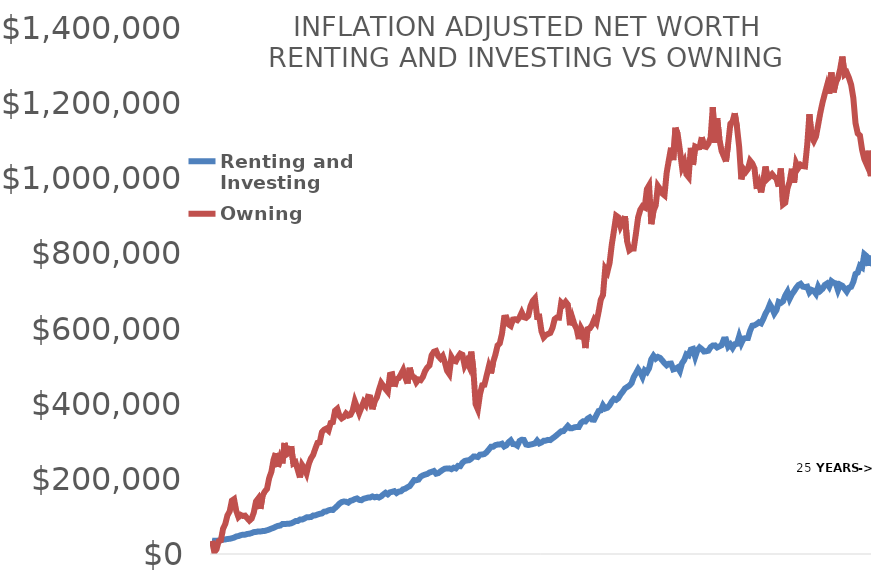
| Category | Renting and Investing | Owning |
|---|---|---|
| 0.0 | 35143 | 35143 |
| 1.0 | 35041.116 | 4970.673 |
| 2.0 | 35237.92 | 12406.018 |
| 3.0 | 35954.826 | 34122.667 |
| 4.0 | 36668.921 | 36554.564 |
| 5.0 | 38039.22 | 67417.757 |
| 6.0 | 38803.411 | 79814.079 |
| 7.0 | 39967.037 | 102888.735 |
| 8.0 | 40494.45 | 113419.601 |
| 9.0 | 41851.406 | 141990.25 |
| 10.0 | 43666.068 | 146000.883 |
| 11.0 | 46679.268 | 114931.032 |
| 12.0 | 47745.613 | 98284.657 |
| 13.0 | 50001.919 | 104050.503 |
| 14.0 | 51463.166 | 101179.522 |
| 15.0 | 51469.582 | 102160.158 |
| 16.0 | 53304.943 | 95342.644 |
| 17.0 | 54004.239 | 88877.305 |
| 18.0 | 55711.023 | 94125.601 |
| 19.0 | 58258.802 | 110587.55 |
| 20.0 | 58789.847 | 139993.731 |
| 21.0 | 60042.64 | 147678.933 |
| 22.0 | 59884.463 | 120287.044 |
| 23.0 | 61008.695 | 155661.869 |
| 24.0 | 61449.11 | 166263.627 |
| 25.0 | 63199.008 | 173331.382 |
| 26.0 | 65118.898 | 202464.821 |
| 27.0 | 67601.989 | 218736.165 |
| 28.0 | 69652.84 | 251401.689 |
| 29.0 | 72584.162 | 268591.856 |
| 30.0 | 74892.972 | 231693.532 |
| 31.0 | 75667.365 | 255499.706 |
| 32.0 | 79641.852 | 241142.728 |
| 33.0 | 79660.314 | 295523.627 |
| 34.0 | 80268.475 | 265312.203 |
| 35.0 | 80443.292 | 269169.767 |
| 36.0 | 81648.869 | 286807.545 |
| 37.0 | 84200.906 | 240844.606 |
| 38.0 | 87601.782 | 244019.191 |
| 39.0 | 87939.642 | 224139.784 |
| 40.0 | 91586.486 | 203647.611 |
| 41.0 | 91673.981 | 237014.867 |
| 42.0 | 94120.109 | 228146.709 |
| 43.0 | 97548.538 | 214489.579 |
| 44.0 | 98049.605 | 239296.116 |
| 45.0 | 98264.089 | 254313.017 |
| 46.0 | 102428.195 | 263626.651 |
| 47.0 | 102775.898 | 280406.265 |
| 48.0 | 104991.545 | 295858.669 |
| 49.0 | 106933.723 | 297210.695 |
| 50.0 | 107917.399 | 324363.613 |
| 51.0 | 112657.497 | 330735.994 |
| 52.0 | 113265.652 | 333657.157 |
| 53.0 | 116256.744 | 328272.815 |
| 54.0 | 117717.206 | 348924.155 |
| 55.0 | 117138.042 | 350915.09 |
| 56.0 | 122545.568 | 381502.656 |
| 57.0 | 127742.079 | 386492.178 |
| 58.0 | 134145.699 | 367459.918 |
| 59.0 | 138209.887 | 360892.552 |
| 60.0 | 139775.365 | 364730.163 |
| 61.0 | 139075.48 | 373949.285 |
| 62.0 | 136729.748 | 368370.564 |
| 63.0 | 141632.043 | 370448.555 |
| 64.0 | 143140.951 | 381634.572 |
| 65.0 | 146216.856 | 406512.777 |
| 66.0 | 147882.155 | 390958.771 |
| 67.0 | 144034.38 | 374876.919 |
| 68.0 | 143203.796 | 389533.519 |
| 69.0 | 147027.722 | 404495.956 |
| 70.0 | 148484.772 | 396653.965 |
| 71.0 | 150128.702 | 418322.13 |
| 72.0 | 150561.775 | 417111.357 |
| 73.0 | 153189.194 | 385182.248 |
| 74.0 | 150841.135 | 406312.844 |
| 75.0 | 152354.716 | 416385.473 |
| 76.0 | 150363.38 | 437116.191 |
| 77.0 | 153413.971 | 455325.083 |
| 78.0 | 158618.437 | 447060.192 |
| 79.0 | 162937.228 | 438876.099 |
| 80.0 | 158862.439 | 431751.978 |
| 81.0 | 164137.173 | 477002.716 |
| 82.0 | 165571.965 | 478400.414 |
| 83.0 | 167259.911 | 445532.046 |
| 84.0 | 162243.717 | 465425.453 |
| 85.0 | 166070.911 | 468051.956 |
| 86.0 | 166894.05 | 478195.837 |
| 87.0 | 172265.184 | 489478.077 |
| 88.0 | 173911.257 | 469415.212 |
| 89.0 | 177887.471 | 453737.065 |
| 90.0 | 180585.931 | 495647.563 |
| 91.0 | 188712.953 | 471991.418 |
| 92.0 | 196727.719 | 470270.581 |
| 93.0 | 196414.628 | 456940.327 |
| 94.0 | 198020.174 | 464416.843 |
| 95.0 | 205984.509 | 462652.301 |
| 96.0 | 209163.503 | 471538.459 |
| 97.0 | 211454.78 | 486925.424 |
| 98.0 | 213069.726 | 496454.355 |
| 99.0 | 216845.16 | 502259.188 |
| 100.0 | 218651.038 | 529393.598 |
| 101.0 | 220861.608 | 538306.335 |
| 102.0 | 213741.094 | 540407.058 |
| 103.0 | 215297.306 | 526693.052 |
| 104.0 | 219832.407 | 520197.931 |
| 105.0 | 223891.438 | 526876.815 |
| 106.0 | 227057.649 | 510033.752 |
| 107.0 | 227614.393 | 487678.423 |
| 108.0 | 227898.199 | 479197.981 |
| 109.0 | 225754.097 | 524504.538 |
| 110.0 | 229637.889 | 514467.458 |
| 111.0 | 227702.194 | 512698.132 |
| 112.0 | 234467.967 | 524581.877 |
| 113.0 | 233746.94 | 533029.376 |
| 114.0 | 242813.731 | 530278.701 |
| 115.0 | 247476.09 | 501545.954 |
| 116.0 | 248925.629 | 512923.176 |
| 117.0 | 249685.456 | 500055.214 |
| 118.0 | 253533.822 | 538688.551 |
| 119.0 | 259206.345 | 488281.129 |
| 120.0 | 259263.016 | 398779.002 |
| 121.0 | 258099.426 | 385049.29 |
| 122.0 | 264365.21 | 425513.651 |
| 123.0 | 264756.349 | 449180.521 |
| 124.0 | 266117.903 | 450324.004 |
| 125.0 | 270923.327 | 474240.12 |
| 126.0 | 278011.131 | 498299.963 |
| 127.0 | 285350.615 | 480754.211 |
| 128.0 | 285578.847 | 511322.861 |
| 129.0 | 289859.016 | 530274.598 |
| 130.0 | 291302.703 | 555120.956 |
| 131.0 | 291558.636 | 560565.057 |
| 132.0 | 293610.697 | 586003.855 |
| 133.0 | 286176.054 | 628860.812 |
| 134.0 | 289324.31 | 629569.224 |
| 135.0 | 297421.62 | 611166.41 |
| 136.0 | 302396.204 | 607101.907 |
| 137.0 | 292641.071 | 624003.154 |
| 138.0 | 291916.552 | 624924.709 |
| 139.0 | 288296.889 | 622343.05 |
| 140.0 | 300774.754 | 629884.078 |
| 141.0 | 304153.64 | 642751.54 |
| 142.0 | 303481.208 | 630309.046 |
| 143.0 | 291444.116 | 628492.712 |
| 144.0 | 289976.82 | 634148.058 |
| 145.0 | 291321.064 | 659818.89 |
| 146.0 | 292637.254 | 673512.683 |
| 147.0 | 294380.728 | 680351.781 |
| 148.0 | 301708.538 | 631264.055 |
| 149.0 | 294369.282 | 631839.208 |
| 150.0 | 296981.382 | 592626.133 |
| 151.0 | 301361.198 | 576654.952 |
| 152.0 | 301780.633 | 582661.092 |
| 153.0 | 303721.002 | 585858.3 |
| 154.0 | 303191.549 | 588335.542 |
| 155.0 | 307772.038 | 601688.979 |
| 156.0 | 311916.009 | 625072.509 |
| 157.0 | 316732.515 | 629501.638 |
| 158.0 | 321824.151 | 629066.824 |
| 159.0 | 326580.93 | 669121.361 |
| 160.0 | 327080.737 | 663546.744 |
| 161.0 | 333890.985 | 671185.945 |
| 162.0 | 340664.075 | 663643.356 |
| 163.0 | 334897.358 | 608820.48 |
| 164.0 | 334904.058 | 629691.606 |
| 165.0 | 337233.037 | 610984.8 |
| 166.0 | 338014.059 | 599732.611 |
| 167.0 | 338171.608 | 571911.323 |
| 168.0 | 349087.38 | 601413.623 |
| 169.0 | 353369.467 | 590666.192 |
| 170.0 | 352733.363 | 548129.177 |
| 171.0 | 360240.619 | 598474.838 |
| 172.0 | 363776.593 | 600637.703 |
| 173.0 | 357708.425 | 609423.182 |
| 174.0 | 357512.543 | 623782.11 |
| 175.0 | 369335.38 | 615361.096 |
| 176.0 | 380668.475 | 644379.35 |
| 177.0 | 382229.608 | 676948.01 |
| 178.0 | 395625.635 | 689333.537 |
| 179.0 | 387130.51 | 759403.628 |
| 180.0 | 389281.396 | 750544.53 |
| 181.0 | 395905.328 | 774338.513 |
| 182.0 | 405793.915 | 823377.071 |
| 183.0 | 413062.126 | 860999.358 |
| 184.0 | 410308.576 | 900367.67 |
| 185.0 | 414796.847 | 896171.546 |
| 186.0 | 424719.236 | 872219.468 |
| 187.0 | 431963.309 | 884291.464 |
| 188.0 | 440552.919 | 899208.553 |
| 189.0 | 444528.192 | 831763.789 |
| 190.0 | 448112.322 | 808489.259 |
| 191.0 | 454674.804 | 812728.678 |
| 192.0 | 470940.491 | 813004.541 |
| 193.0 | 480897.959 | 852643.852 |
| 194.0 | 491785.763 | 896249.205 |
| 195.0 | 483118.519 | 916314.042 |
| 196.0 | 471253.677 | 925587.743 |
| 197.0 | 488656.722 | 922423.519 |
| 198.0 | 484130.001 | 971163.245 |
| 199.0 | 494780.655 | 981094.499 |
| 200.0 | 518261.219 | 877862.47 |
| 201.0 | 527605.298 | 913318.442 |
| 202.0 | 519969.556 | 927561.955 |
| 203.0 | 524500.489 | 979595.775 |
| 204.0 | 521913.841 | 971313.033 |
| 205.0 | 515150.061 | 959544.858 |
| 206.0 | 507859.258 | 954754.111 |
| 207.0 | 502291.711 | 1015092.232 |
| 208.0 | 506469.531 | 1048986.007 |
| 209.0 | 506787.598 | 1081433.421 |
| 210.0 | 491345.84 | 1048432.203 |
| 211.0 | 493169.501 | 1134555.113 |
| 212.0 | 496631.706 | 1117609.072 |
| 213.0 | 486969.925 | 1076163.057 |
| 214.0 | 507880.889 | 1030002.658 |
| 215.0 | 516328.453 | 1043379.045 |
| 216.0 | 531577.701 | 1010507.836 |
| 217.0 | 528648.875 | 1003200.545 |
| 218.0 | 544095.355 | 1081076.273 |
| 219.0 | 545951.323 | 1035596.247 |
| 220.0 | 524874.648 | 1084367.789 |
| 221.0 | 542231.085 | 1081752.921 |
| 222.0 | 549718.922 | 1082620.321 |
| 223.0 | 545116.779 | 1109319.184 |
| 224.0 | 538927.501 | 1085060.015 |
| 225.0 | 539672.181 | 1083391.227 |
| 226.0 | 541202.15 | 1092320.935 |
| 227.0 | 550560.952 | 1107945.385 |
| 228.0 | 554912.401 | 1189320.061 |
| 229.0 | 555209.284 | 1094853.879 |
| 230.0 | 549668.701 | 1159813.432 |
| 231.0 | 552618.966 | 1104963.36 |
| 232.0 | 555673.528 | 1072837.932 |
| 233.0 | 570937.663 | 1059031.672 |
| 234.0 | 571235.82 | 1044818.035 |
| 235.0 | 551799.367 | 1091528.357 |
| 236.0 | 557537.295 | 1144852.405 |
| 237.0 | 548545.83 | 1151117.413 |
| 238.0 | 558405.007 | 1172895.051 |
| 239.0 | 559358.031 | 1136664.584 |
| 240.0 | 578985.02 | 1084224.401 |
| 241.0 | 561078.568 | 997056.481 |
| 242.0 | 573585.157 | 1024455.914 |
| 243.0 | 574553.033 | 1016885.624 |
| 244.0 | 574630.205 | 1024643.29 |
| 245.0 | 594355.355 | 1046592.85 |
| 246.0 | 607699.636 | 1039375.884 |
| 247.0 | 608865.253 | 1025931.347 |
| 248.0 | 612113.368 | 971627.482 |
| 249.0 | 616860.32 | 986739.729 |
| 250.0 | 613995.781 | 962395.955 |
| 251.0 | 625666.398 | 993474.994 |
| 252.0 | 639609.55 | 1031490.209 |
| 253.0 | 649847.094 | 999260.921 |
| 254.0 | 664307.764 | 1004795.059 |
| 255.0 | 654336.252 | 1010956.601 |
| 256.0 | 640110.001 | 1003875.951 |
| 257.0 | 649342.01 | 998922.191 |
| 258.0 | 670891.388 | 978036.401 |
| 259.0 | 668356.106 | 1025943.779 |
| 260.0 | 672710.477 | 930448.896 |
| 261.0 | 687998.895 | 934906.995 |
| 262.0 | 698075.109 | 972786.911 |
| 263.0 | 679451.33 | 991294.168 |
| 264.0 | 691184.281 | 1025522.613 |
| 265.0 | 699213.994 | 988024.296 |
| 266.0 | 708473.032 | 1040057.178 |
| 267.0 | 715817.18 | 1027715.532 |
| 268.0 | 718984.715 | 1035976.567 |
| 269.0 | 711680.771 | 1032394.562 |
| 270.0 | 710331.542 | 1031507.552 |
| 271.0 | 711679.995 | 1088916.214 |
| 272.0 | 696398.405 | 1170585.261 |
| 273.0 | 702862.994 | 1110258.699 |
| 274.0 | 700347.082 | 1099085.849 |
| 275.0 | 692369.478 | 1111391.579 |
| 276.0 | 711352.818 | 1143043.63 |
| 277.0 | 700730.031 | 1175060.886 |
| 278.0 | 706010.251 | 1202210.117 |
| 279.0 | 716069.265 | 1224808.194 |
| 280.0 | 719917.372 | 1246455.926 |
| 281.0 | 711258.034 | 1225292.719 |
| 282.0 | 726243.391 | 1281569.953 |
| 283.0 | 721952.657 | 1228657.621 |
| 284.0 | 720241.541 | 1255082.668 |
| 285.0 | 702228.977 | 1266595.055 |
| 286.0 | 716930.093 | 1290229.683 |
| 287.0 | 713852.304 | 1323968.867 |
| 288.0 | 706376.139 | 1276527.257 |
| 289.0 | 698547.64 | 1281259.422 |
| 290.0 | 708699.975 | 1267284.771 |
| 291.0 | 711125.255 | 1248867.188 |
| 292.0 | 724194.637 | 1213814.102 |
| 293.0 | 745518.628 | 1146546.546 |
| 294.0 | 748883.06 | 1119448.179 |
| 295.0 | 767033.802 | 1113734.4 |
| 296.0 | 762724.651 | 1075712.047 |
| 297.0 | 797879.533 | 1051264.102 |
| 298.0 | 792883.709 | 1038061.69 |
| 299.0 | 767075.98 | 1073365.425 |
| 300.0 | 794308.502 | 1005701.786 |